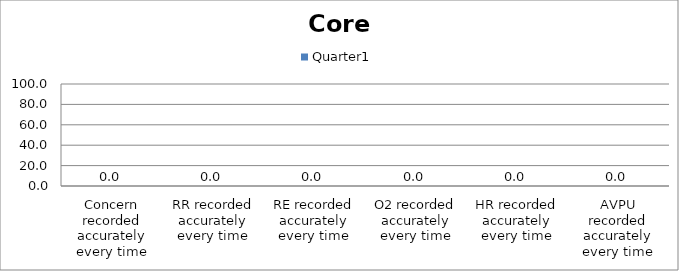
| Category | Quarter1 |
|---|---|
| Concern recorded accurately every time | 0 |
| RR recorded accurately every time | 0 |
| RE recorded accurately every time | 0 |
| O2 recorded accurately every time | 0 |
| HR recorded accurately every time | 0 |
| AVPU recorded accurately every time | 0 |